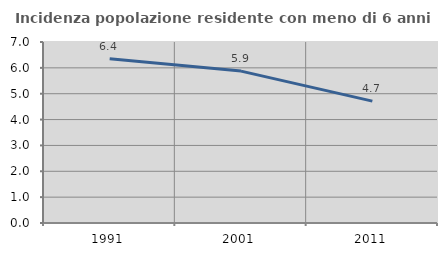
| Category | Incidenza popolazione residente con meno di 6 anni |
|---|---|
| 1991.0 | 6.354 |
| 2001.0 | 5.874 |
| 2011.0 | 4.713 |